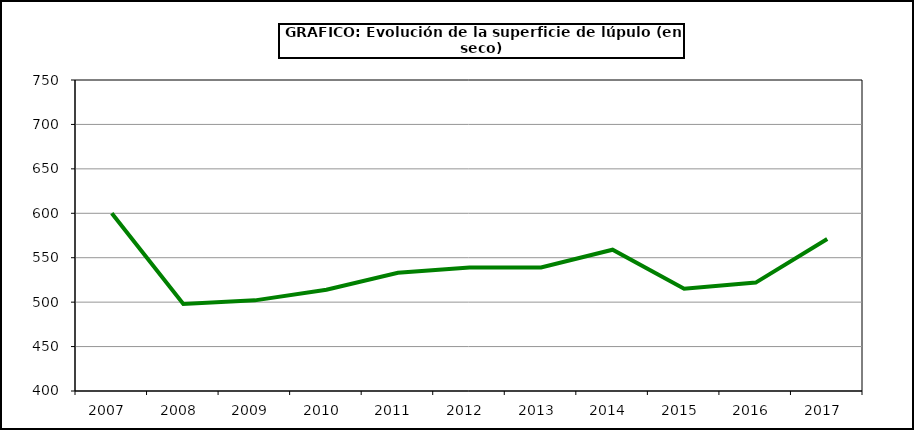
| Category | Superficie |
|---|---|
| 2007.0 | 600 |
| 2008.0 | 498 |
| 2009.0 | 502 |
| 2010.0 | 514 |
| 2011.0 | 533 |
| 2012.0 | 539 |
| 2013.0 | 539 |
| 2014.0 | 559 |
| 2015.0 | 515 |
| 2016.0 | 522 |
| 2017.0 | 571 |